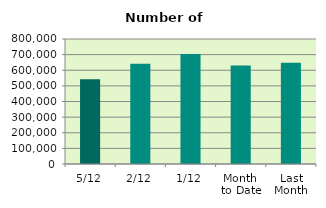
| Category | Series 0 |
|---|---|
| 5/12 | 542726 |
| 2/12 | 641722 |
| 1/12 | 704664 |
| Month 
to Date | 629704 |
| Last
Month | 647745.364 |